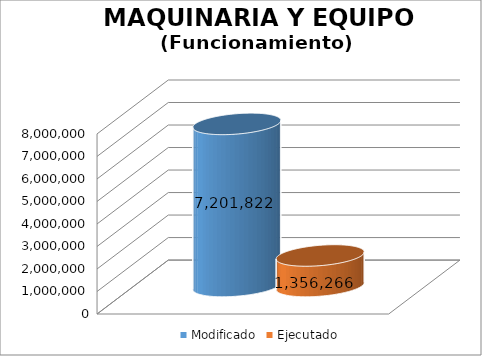
| Category | Modificado | Ejecutado |
|---|---|---|
| 0 | 7201822 | 1356265.55 |